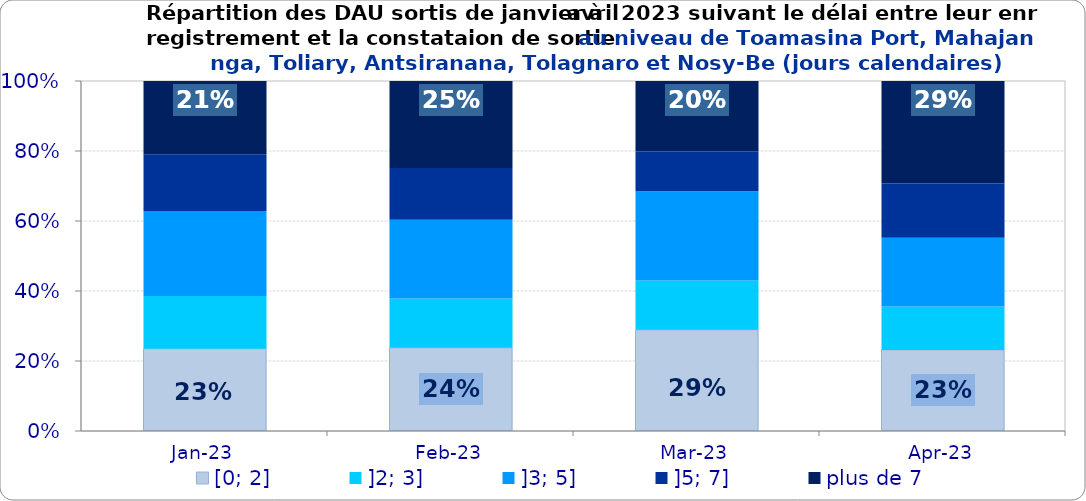
| Category | [0; 2] | ]2; 3] | ]3; 5] | ]5; 7] | plus de 7 |
|---|---|---|---|---|---|
| 2023-01-01 | 0.235 | 0.151 | 0.243 | 0.162 | 0.21 |
| 2023-02-01 | 0.238 | 0.141 | 0.225 | 0.148 | 0.248 |
| 2023-03-01 | 0.289 | 0.141 | 0.255 | 0.114 | 0.201 |
| 2023-04-01 | 0.231 | 0.124 | 0.196 | 0.155 | 0.293 |